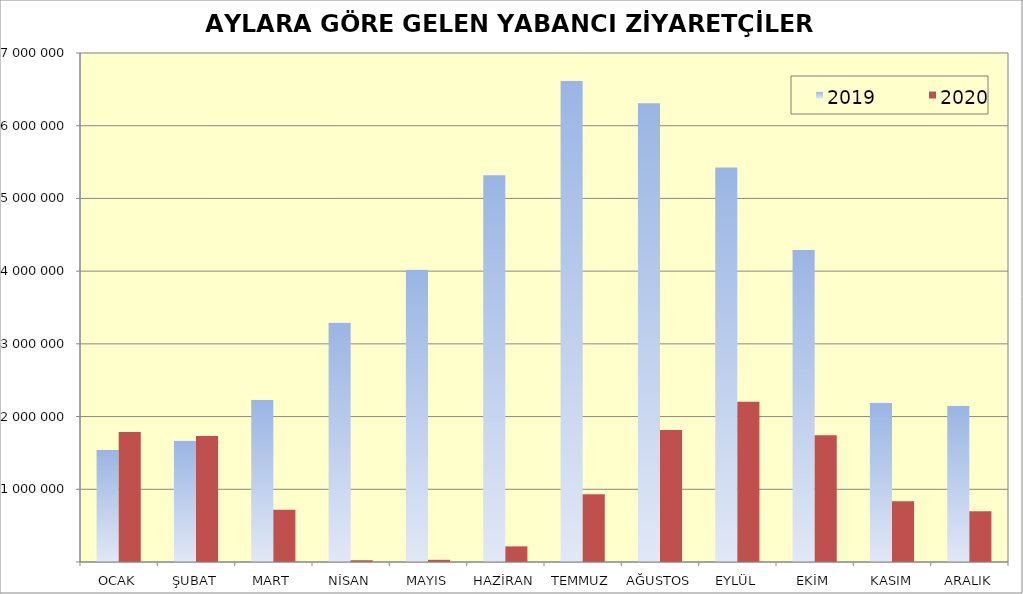
| Category | 2019 | 2020 |
|---|---|---|
| OCAK | 1539496 | 1787435 |
| ŞUBAT | 1670238 | 1733112 |
| MART | 2232358 | 718097 |
| NİSAN | 3293176 | 24238 |
| MAYIS | 4022254 | 29829 |
| HAZİRAN | 5318984 | 214768 |
| TEMMUZ | 6617380 | 932927 |
| AĞUSTOS | 6307508 | 1814701 |
| EYLÜL | 5426818 | 2203482 |
| EKİM | 4291574 | 1742303 |
| KASIM | 2190622 | 833991 |
| ARALIK | 2147878 | 699330 |